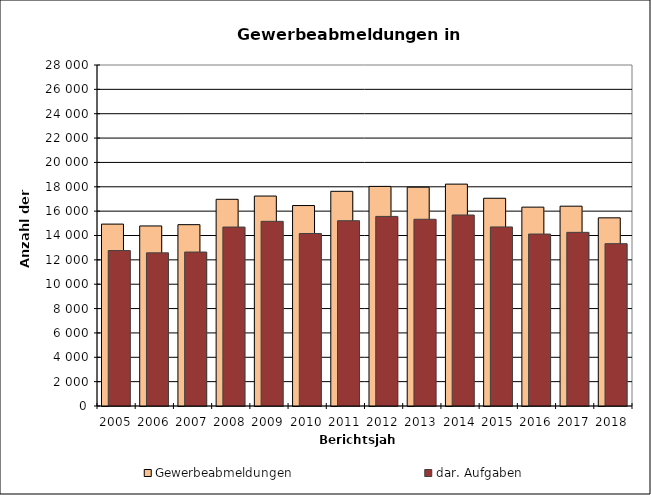
| Category | Gewerbeabmeldungen | dar. Aufgaben |
|---|---|---|
| 2005.0 | 14936 | 12763 |
| 2006.0 | 14785 | 12576 |
| 2007.0 | 14890 | 12642 |
| 2008.0 | 16972 | 14693 |
| 2009.0 | 17240 | 15163 |
| 2010.0 | 16460 | 14163 |
| 2011.0 | 17629 | 15213 |
| 2012.0 | 18032 | 15567 |
| 2013.0 | 17968 | 15333 |
| 2014.0 | 18219 | 15684 |
| 2015.0 | 17058 | 14703 |
| 2016.0 | 16329 | 14120 |
| 2017.0 | 16407 | 14259 |
| 2018.0 | 15450 | 13328 |